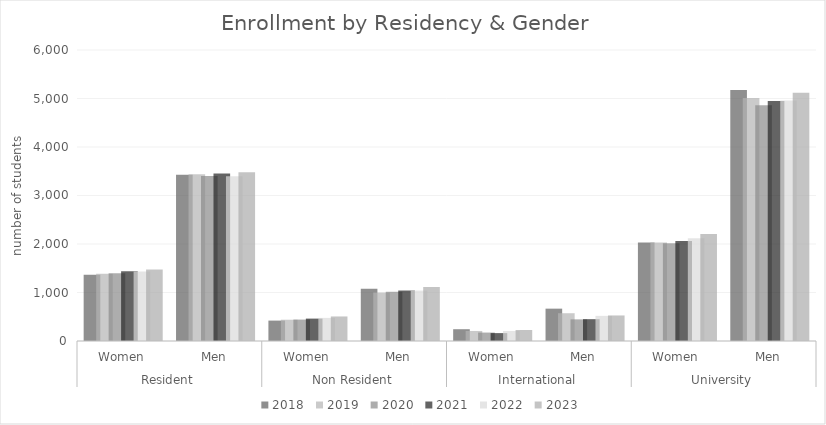
| Category | 2018  | 2019  | 2020  | 2021  | 2022  | 2023  |
|---|---|---|---|---|---|---|
| 0 | 1366 | 1387 | 1397 | 1438 | 1433 | 1475 |
| 1 | 3427 | 3436 | 3401 | 3455 | 3398 | 3478 |
| 2 | 421 | 439 | 442 | 462 | 477 | 506 |
| 3 | 1079 | 999 | 1015 | 1041 | 1040 | 1111 |
| 4 | 243 | 207 | 174 | 163 | 207 | 227 |
| 5 | 667 | 573 | 446 | 450 | 519 | 527 |
| 6 | 2030 | 2033 | 2013 | 2063 | 2117 | 2208 |
| 7 | 5173 | 5008 | 4862 | 4946 | 4957 | 5116 |